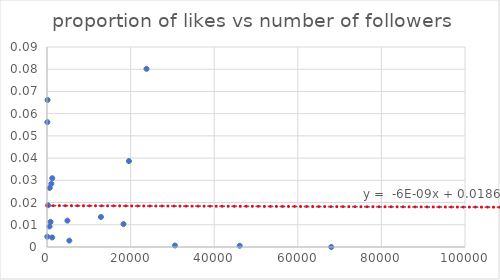
| Category | Series 0 |
|---|---|
| 89.0 | 0.056 |
| 763700.0 | 0.011 |
| 853.0 | 0.011 |
| 23800.0 | 0.08 |
| 1260.0 | 0.031 |
| 1242.0 | 0.004 |
| 30600.0 | 0.001 |
| 652.0 | 0.027 |
| 397600.0 | 0.003 |
| 141.0 | 0.066 |
| 1041.0 | 0.028 |
| 4887.0 | 0.012 |
| 5341.0 | 0.003 |
| 221100.0 | 0.036 |
| 612.0 | 0.009 |
| 12900.0 | 0.014 |
| 801600.0 | 0.009 |
| 46100.0 | 0.001 |
| 18300.0 | 0.01 |
| 312600.0 | 0.009 |
| 2700000.0 | 0.001 |
| 68000.0 | 0 |
| 271200.0 | 0.001 |
| 320200.0 | 0 |
| 121200.0 | 0 |
| 838500.0 | 0 |
| 71.0 | 0.005 |
| 4100000.0 | 0 |
| 19600.0 | 0.039 |
| 248.0 | 0.019 |